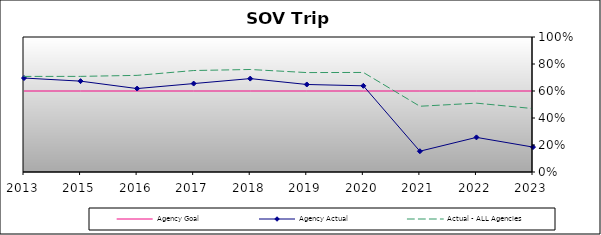
| Category | Agency Goal | Agency Actual | Actual - ALL Agencies |
|---|---|---|---|
| 2013.0 | 0.6 | 0.696 | 0.708 |
| 2015.0 | 0.6 | 0.673 | 0.708 |
| 2016.0 | 0.6 | 0.618 | 0.716 |
| 2017.0 | 0.6 | 0.655 | 0.752 |
| 2018.0 | 0.6 | 0.692 | 0.759 |
| 2019.0 | 0.6 | 0.648 | 0.736 |
| 2020.0 | 0.6 | 0.638 | 0.737 |
| 2021.0 | 0.6 | 0.154 | 0.487 |
| 2022.0 | 0.6 | 0.256 | 0.51 |
| 2023.0 | 0.6 | 0.184 | 0.47 |